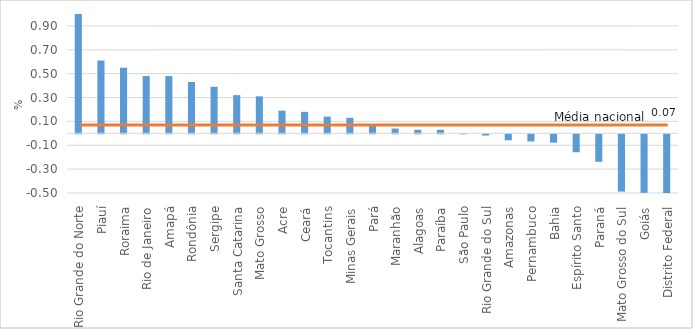
| Category | Escolha |
|---|---|
| Rio Grande do Norte | 1.03 |
| Piauí | 0.61 |
| Roraima | 0.55 |
| Rio de Janeiro | 0.48 |
| Amapá | 0.48 |
| Rondônia | 0.43 |
| Sergipe | 0.39 |
| Santa Catarina | 0.32 |
| Mato Grosso | 0.31 |
| Acre | 0.19 |
| Ceará | 0.18 |
| Tocantins | 0.14 |
| Minas Gerais | 0.13 |
| Pará | 0.07 |
| Maranhão | 0.04 |
| Alagoas | 0.03 |
| Paraíba | 0.03 |
| São Paulo | 0 |
| Rio Grande do Sul | -0.01 |
| Amazonas | -0.05 |
| Pernambuco | -0.06 |
| Bahia | -0.07 |
| Espírito Santo | -0.15 |
| Paraná | -0.23 |
| Mato Grosso do Sul | -0.48 |
| Goiás | -0.49 |
| Distrito Federal | -0.62 |